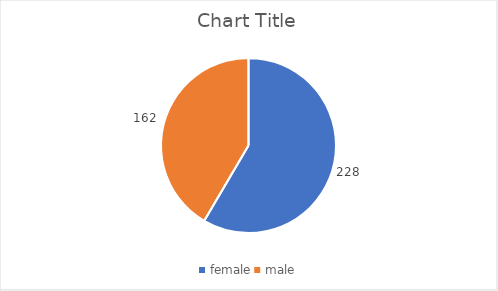
| Category | Series 0 |
|---|---|
| female | 228 |
| male | 162 |